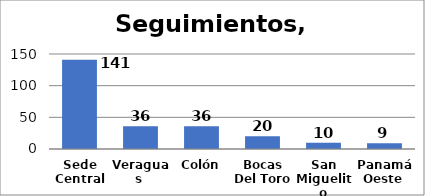
| Category | Series 0 |
|---|---|
| Sede Central | 141 |
| Veraguas  | 36 |
| Colón | 36 |
| Bocas Del Toro | 20 |
| San Miguelito | 10 |
| Panamá Oeste  | 9 |